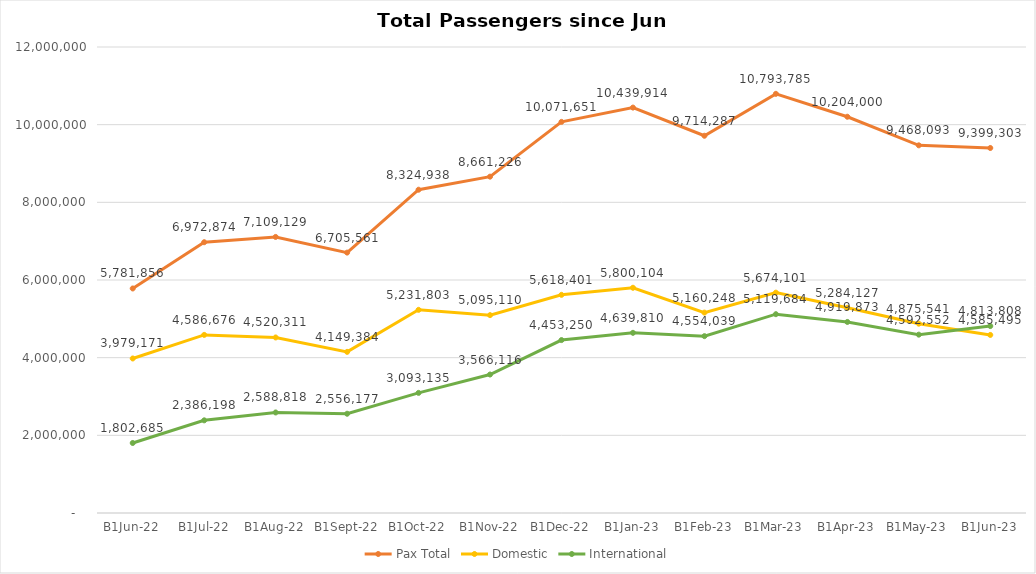
| Category | Pax Total |  Domestic  |  International  |
|---|---|---|---|
| 2022-06-01 | 5781856 | 3979171 | 1802685 |
| 2022-07-01 | 6972874 | 4586676 | 2386198 |
| 2022-08-01 | 7109129 | 4520311 | 2588818 |
| 2022-09-01 | 6705561 | 4149384 | 2556177 |
| 2022-10-01 | 8324938 | 5231803 | 3093135 |
| 2022-11-01 | 8661226 | 5095110 | 3566116 |
| 2022-12-01 | 10071651 | 5618401 | 4453250 |
| 2023-01-01 | 10439914 | 5800104 | 4639810 |
| 2023-02-01 | 9714287 | 5160248 | 4554039 |
| 2023-03-01 | 10793785 | 5674101 | 5119684 |
| 2023-04-01 | 10204000 | 5284127 | 4919873 |
| 2023-05-01 | 9468093 | 4875541 | 4592552 |
| 2023-06-01 | 9399303 | 4585495 | 4813808 |